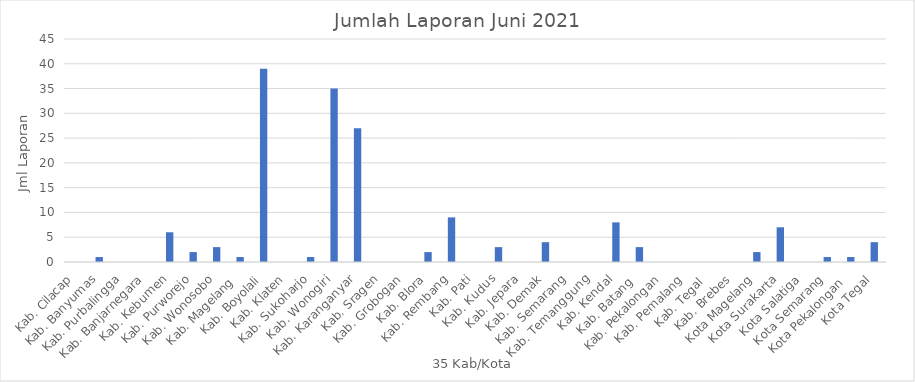
| Category | Series 0 |
|---|---|
| Kab. Cilacap | 0 |
| Kab. Banyumas | 1 |
| Kab. Purbalingga | 0 |
| Kab. Banjarnegara | 0 |
| Kab. Kebumen | 6 |
| Kab. Purworejo | 2 |
| Kab. Wonosobo | 3 |
| Kab. Magelang  | 1 |
| Kab. Boyolali | 39 |
| Kab. Klaten | 0 |
| Kab. Sukoharjo | 1 |
| Kab. Wonogiri | 35 |
| Kab. Karanganyar | 27 |
| Kab. Sragen | 0 |
| Kab. Grobogan | 0 |
| Kab. Blora | 2 |
| Kab. Rembang | 9 |
| Kab. Pati | 0 |
| Kab. Kudus | 3 |
| Kab. Jepara | 0 |
| Kab. Demak | 4 |
| Kab. Semarang | 0 |
| Kab. Temanggung | 0 |
| Kab. Kendal | 8 |
| Kab. Batang  | 3 |
| Kab. Pekalongan | 0 |
| Kab. Pemalang | 0 |
| Kab. Tegal  | 0 |
| Kab. Brebes | 0 |
| Kota Magelang | 2 |
| Kota Surakarta | 7 |
| Kota Salatiga | 0 |
| Kota Semarang | 1 |
| Kota Pekalongan  | 1 |
| Kota Tegal | 4 |